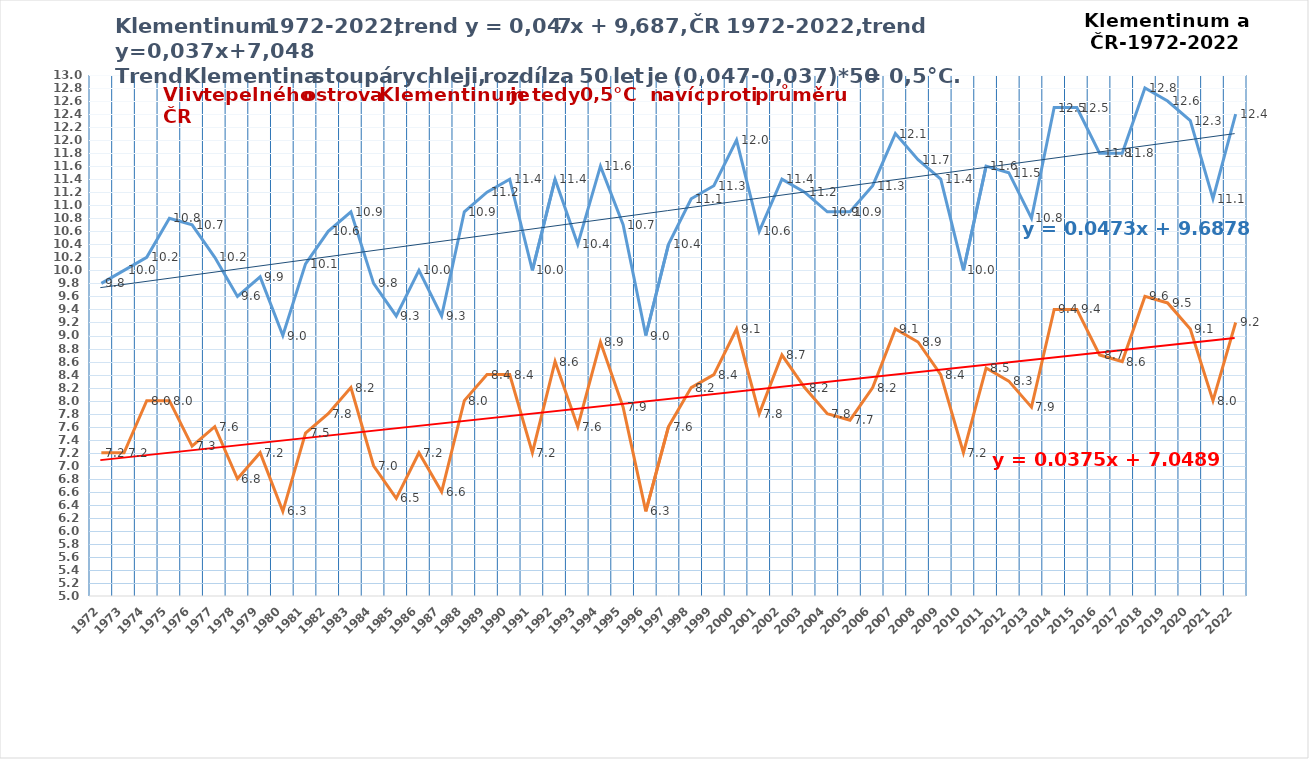
| Category | Klementinum [°C] | ČR roční teplota [°C] |
|---|---|---|
| 1972 | 9.8 | 7.2 |
| 1973 | 10 | 7.2 |
| 1974 | 10.2 | 8 |
| 1975 | 10.8 | 8 |
| 1976 | 10.7 | 7.3 |
| 1977 | 10.2 | 7.6 |
| 1978 | 9.6 | 6.8 |
| 1979 | 9.9 | 7.2 |
| 1980 | 9 | 6.3 |
| 1981 | 10.1 | 7.5 |
| 1982 | 10.6 | 7.8 |
| 1983 | 10.9 | 8.2 |
| 1984 | 9.8 | 7 |
| 1985 | 9.3 | 6.5 |
| 1986 | 10 | 7.2 |
| 1987 | 9.3 | 6.6 |
| 1988 | 10.9 | 8 |
| 1989 | 11.2 | 8.4 |
| 1990 | 11.4 | 8.4 |
| 1991 | 10 | 7.2 |
| 1992 | 11.4 | 8.6 |
| 1993 | 10.4 | 7.6 |
| 1994 | 11.6 | 8.9 |
| 1995 | 10.7 | 7.9 |
| 1996 | 9 | 6.3 |
| 1997 | 10.4 | 7.6 |
| 1998 | 11.1 | 8.2 |
| 1999 | 11.3 | 8.4 |
| 2000 | 12 | 9.1 |
| 2001 | 10.6 | 7.8 |
| 2002 | 11.4 | 8.7 |
| 2003 | 11.2 | 8.2 |
| 2004 | 10.9 | 7.8 |
| 2005 | 10.9 | 7.7 |
| 2006 | 11.3 | 8.2 |
| 2007 | 12.1 | 9.1 |
| 2008 | 11.7 | 8.9 |
| 2009 | 11.4 | 8.4 |
| 2010 | 10 | 7.2 |
| 2011 | 11.6 | 8.5 |
| 2012 | 11.5 | 8.3 |
| 2013 | 10.8 | 7.9 |
| 2014 | 12.5 | 9.4 |
| 2015 | 12.5 | 9.4 |
| 2016 | 11.8 | 8.7 |
| 2017 | 11.8 | 8.6 |
| 2018 | 12.8 | 9.6 |
| 2019 | 12.6 | 9.5 |
| 2020 | 12.3 | 9.1 |
| 2021 | 11.1 | 8 |
| 2022 | 12.4 | 9.2 |